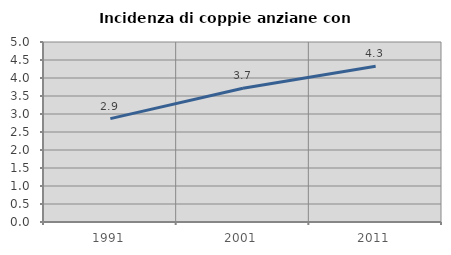
| Category | Incidenza di coppie anziane con figli |
|---|---|
| 1991.0 | 2.872 |
| 2001.0 | 3.714 |
| 2011.0 | 4.324 |